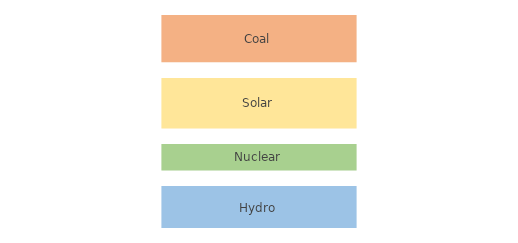
| Category | Coal | Blank 1 | Solar | Blank 2 | Nuclear | Blank 3 | Hydro |
|---|---|---|---|---|---|---|---|
| Value | 420 | 150 | 450 | 150 | 230 | 150 | 380 |